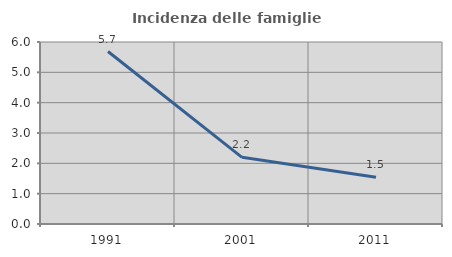
| Category | Incidenza delle famiglie numerose |
|---|---|
| 1991.0 | 5.686 |
| 2001.0 | 2.199 |
| 2011.0 | 1.538 |